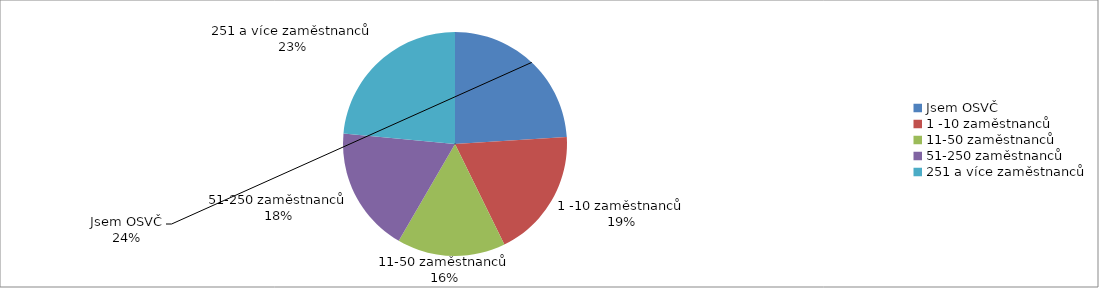
| Category | Series 0 |
|---|---|
| Jsem OSVČ | 195 |
| 1 -10 zaměstnanců | 152 |
| 11-50 zaměstnanců | 127 |
| 51-250 zaměstnanců | 147 |
| 251 a více zaměstnanců | 191 |